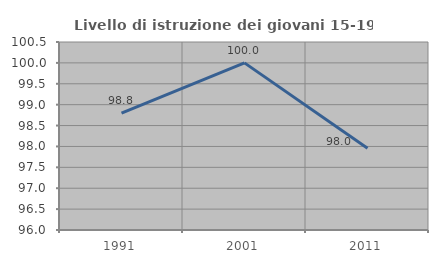
| Category | Livello di istruzione dei giovani 15-19 anni |
|---|---|
| 1991.0 | 98.795 |
| 2001.0 | 100 |
| 2011.0 | 97.959 |